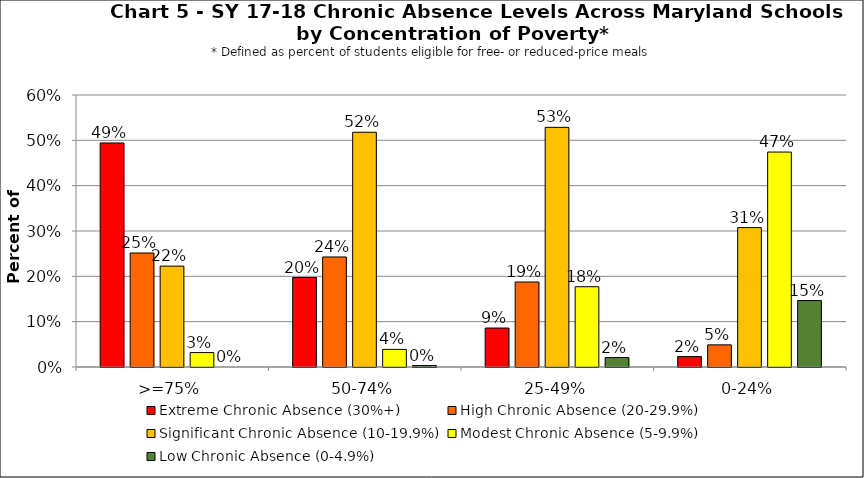
| Category | Extreme Chronic Absence (30%+) | High Chronic Absence (20-29.9%) | Significant Chronic Absence (10-19.9%) | Modest Chronic Absence (5-9.9%) | Low Chronic Absence (0-4.9%) |
|---|---|---|---|---|---|
| 0 | 0.494 | 0.251 | 0.223 | 0.032 | 0 |
| 1 | 0.197 | 0.243 | 0.518 | 0.039 | 0.003 |
| 2 | 0.086 | 0.188 | 0.529 | 0.177 | 0.021 |
| 3 | 0.023 | 0.049 | 0.307 | 0.474 | 0.147 |